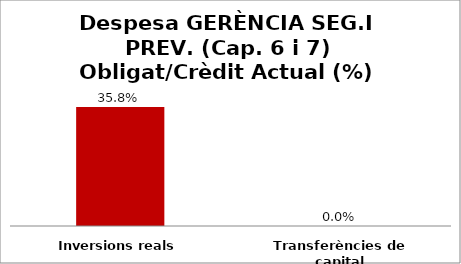
| Category | Series 0 |
|---|---|
| Inversions reals | 0.358 |
| Transferències de capital | 0 |